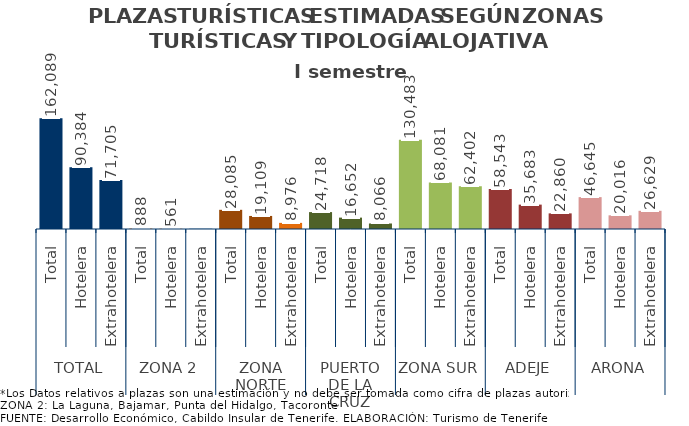
| Category | I semestre 2014 |
|---|---|
| 0 | 162089 |
| 1 | 90384 |
| 2 | 71705 |
| 3 | 888 |
| 4 | 561 |
| 5 | 327 |
| 6 | 28085 |
| 7 | 19109 |
| 8 | 8976 |
| 9 | 24718 |
| 10 | 16652 |
| 11 | 8066 |
| 12 | 130483 |
| 13 | 68081 |
| 14 | 62402 |
| 15 | 58543 |
| 16 | 35683 |
| 17 | 22860 |
| 18 | 46645 |
| 19 | 20016 |
| 20 | 26629 |